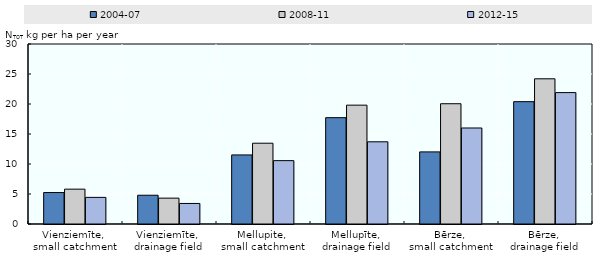
| Category | 2004-07 | 2008-11 | 2012-15 |
|---|---|---|---|
| Vienziemīte, 
small catchment | 5.244 | 5.809 | 4.437 |
| Vienziemīte, 
drainage field | 4.797 | 4.312 | 3.424 |
| Mellupite, 
small catchment | 11.513 | 13.464 | 10.56 |
| Mellupīte, 
drainage field | 17.724 | 19.809 | 13.7 |
| Bērze, 
small catchment | 12.018 | 20.046 | 16 |
| Bērze, 
drainage field | 20.389 | 24.2 | 21.9 |